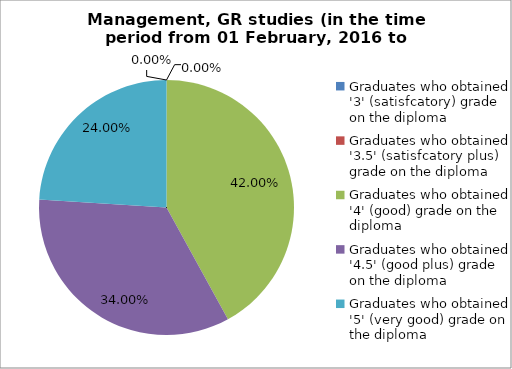
| Category | Series 0 |
|---|---|
| Graduates who obtained '3' (satisfcatory) grade on the diploma | 0 |
| Graduates who obtained '3.5' (satisfcatory plus) grade on the diploma | 0 |
| Graduates who obtained '4' (good) grade on the diploma | 42 |
| Graduates who obtained '4.5' (good plus) grade on the diploma | 34 |
| Graduates who obtained '5' (very good) grade on the diploma | 24 |